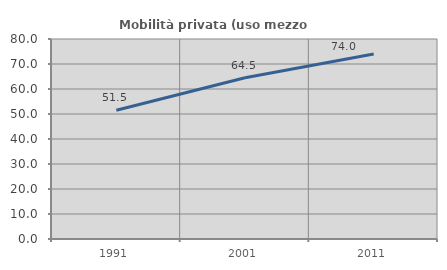
| Category | Mobilità privata (uso mezzo privato) |
|---|---|
| 1991.0 | 51.469 |
| 2001.0 | 64.499 |
| 2011.0 | 74.003 |